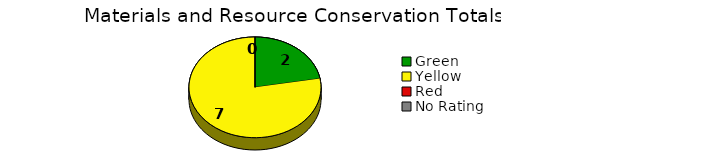
| Category | Series 0 |
|---|---|
| Green | 2 |
| Yellow | 7 |
| Red | 0 |
| No Rating | 0 |